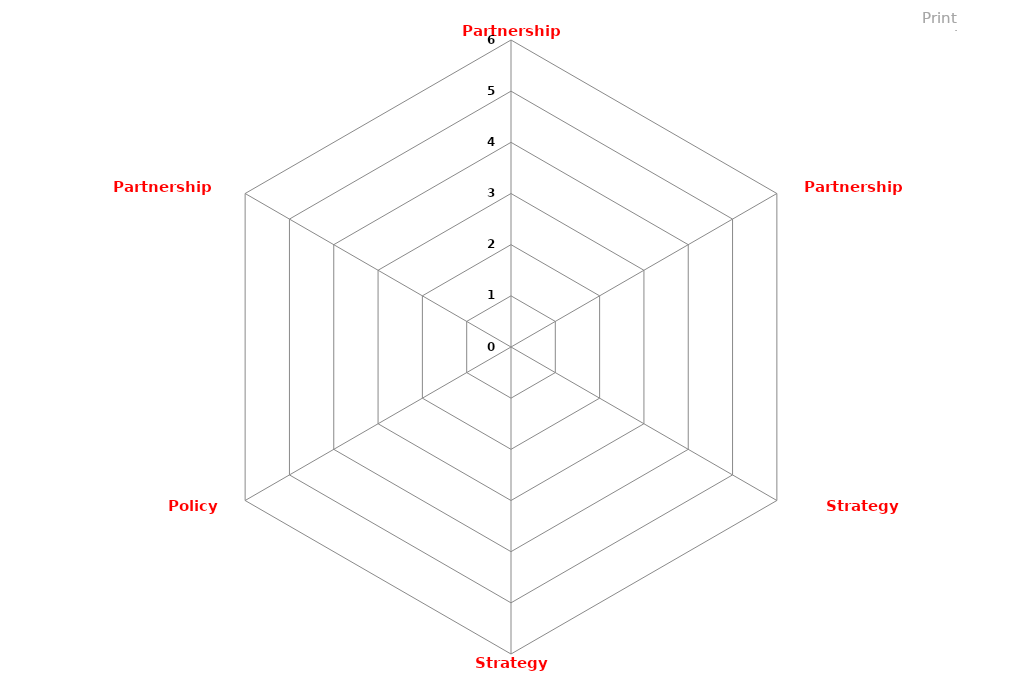
| Category | 0 |
|---|---|
| Partnership structure | 0 |
| Partnership working | 0 |
| Strategy development | 0 |
| Strategy delivery | 0 |
| Policy impact | 0 |
| Partnership resilience | 0 |